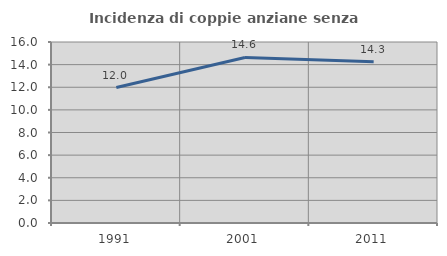
| Category | Incidenza di coppie anziane senza figli  |
|---|---|
| 1991.0 | 11.975 |
| 2001.0 | 14.63 |
| 2011.0 | 14.262 |